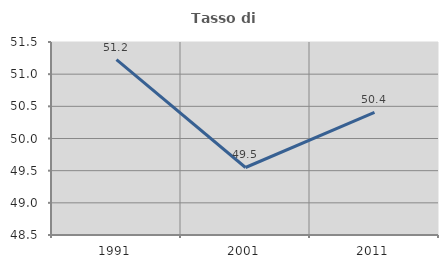
| Category | Tasso di occupazione   |
|---|---|
| 1991.0 | 51.227 |
| 2001.0 | 49.549 |
| 2011.0 | 50.407 |